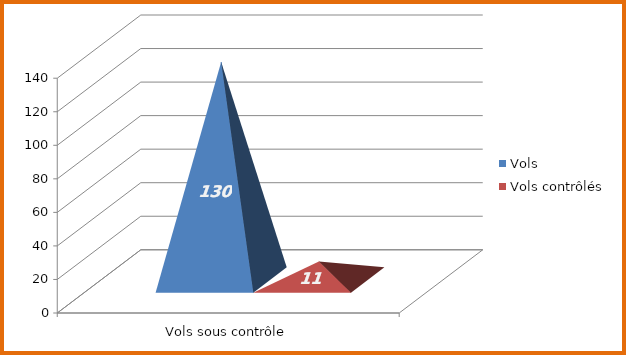
| Category | Vols | Vols contrôlés |
|---|---|---|
| 0 | 130 | 11 |